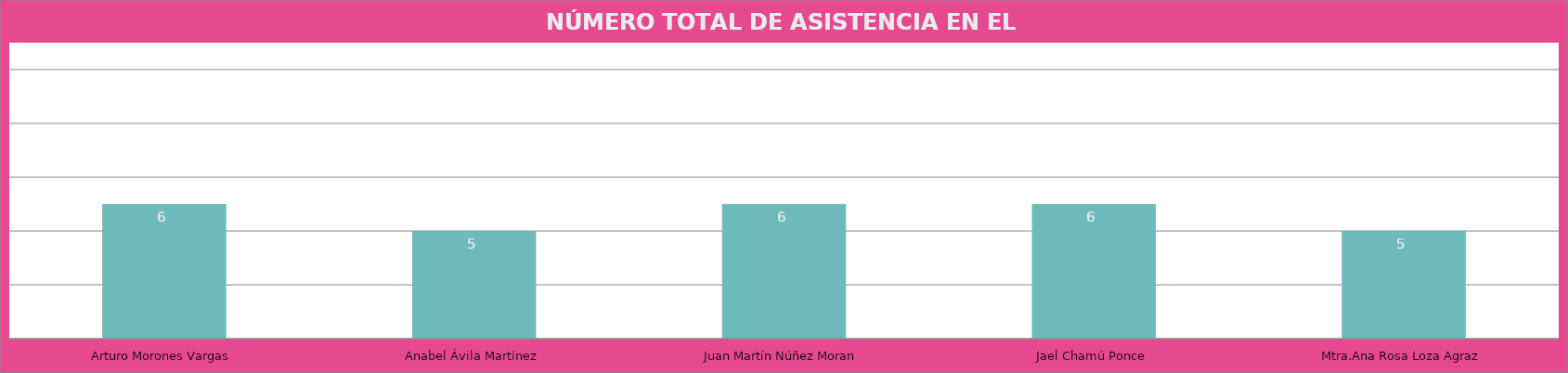
| Category | Arturo Morones Vargas |
|---|---|
| Arturo Morones Vargas | 6 |
| Anabel Ávila Martínez | 5 |
| Juan Martín Núñez Moran | 6 |
| Jael Chamú Ponce | 6 |
| Mtra.Ana Rosa Loza Agraz | 5 |